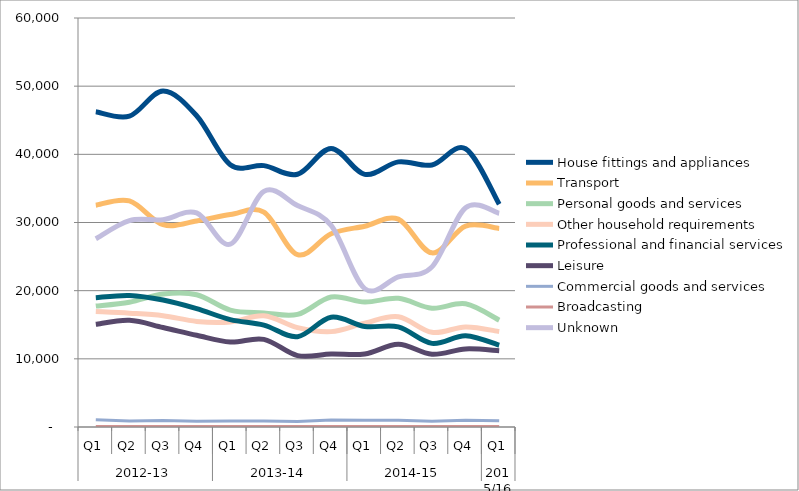
| Category | House fittings and appliances | Transport | Personal goods and services | Other household requirements | Professional and financial services | Leisure | Commercial goods and services | Broadcasting | Unknown |
|---|---|---|---|---|---|---|---|---|---|
| 0 | 46246 | 32538 | 17737 | 16937 | 18973 | 15062 | 1053 | 77 | 27618 |
| 1 | 45601 | 33167 | 18301 | 16696 | 19297 | 15652 | 890 | 75 | 30283 |
| 2 | 49275 | 29678 | 19497 | 16328 | 18628 | 14596 | 944 | 90 | 30415 |
| 3 | 45662 | 30219 | 19405 | 15493 | 17367 | 13456 | 851 | 90 | 31405 |
| 4 | 38474 | 31169 | 17157 | 15417 | 15761 | 12461 | 876 | 62 | 26816 |
| 5 | 38341 | 31528 | 16739 | 16314 | 14953 | 12859 | 867 | 65 | 34563 |
| 6 | 37076 | 25280 | 16513 | 14581 | 13254 | 10479 | 821 | 64 | 32483 |
| 7 | 40871 | 28347 | 19069 | 13991 | 16104 | 10712 | 1026 | 65 | 29583 |
| 8 | 37065 | 29458 | 18331 | 15238 | 14750 | 10710 | 981 | 70 | 20300 |
| 9 | 38897 | 30490 | 18882 | 16170 | 14681 | 12126 | 1000 | 84 | 22027 |
| 10 | 38434 | 25546 | 17424 | 13889 | 12266 | 10674 | 859 | 59 | 23490 |
| 11 | 40818 | 29472 | 18075 | 14681 | 13400 | 11458 | 995 | 76 | 32164 |
| 12 | 32681 | 29135 | 15671 | 14012 | 11993 | 11181 | 911 | 64 | 31359 |